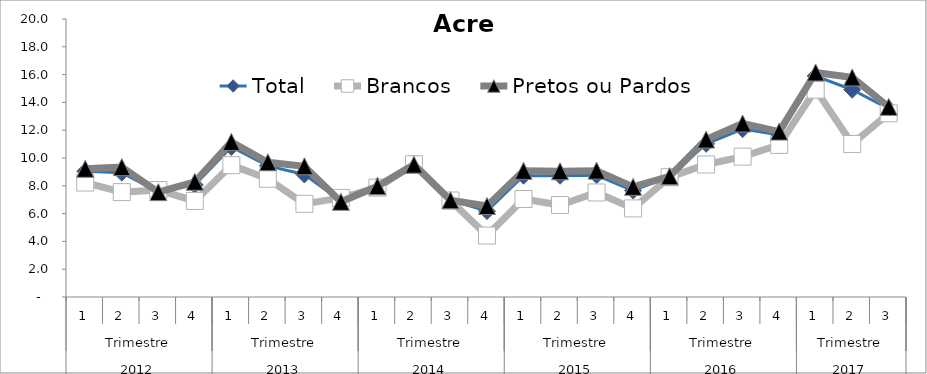
| Category | Total | Brancos | Pretos ou Pardos |
|---|---|---|---|
| 0 | 9.047 | 8.235 | 9.224 |
| 1 | 8.942 | 7.545 | 9.342 |
| 2 | 7.552 | 7.696 | 7.544 |
| 3 | 8.062 | 6.91 | 8.289 |
| 4 | 10.792 | 9.485 | 11.158 |
| 5 | 9.436 | 8.505 | 9.694 |
| 6 | 8.813 | 6.703 | 9.405 |
| 7 | 6.925 | 7.13 | 6.849 |
| 8 | 7.994 | 7.867 | 7.966 |
| 9 | 9.564 | 9.552 | 9.522 |
| 10 | 6.958 | 6.941 | 6.958 |
| 11 | 6.177 | 4.421 | 6.544 |
| 12 | 8.722 | 7.051 | 9.076 |
| 13 | 8.723 | 6.615 | 9.045 |
| 14 | 8.759 | 7.521 | 9.091 |
| 15 | 7.651 | 6.373 | 7.925 |
| 16 | 8.677 | 8.618 | 8.683 |
| 17 | 11.017 | 9.534 | 11.329 |
| 18 | 12.078 | 10.096 | 12.484 |
| 19 | 11.668 | 10.944 | 11.899 |
| 20 | 15.899 | 14.916 | 16.152 |
| 21 | 14.911 | 11.01 | 15.797 |
| 22 | 13.545 | 13.214 | 13.679 |